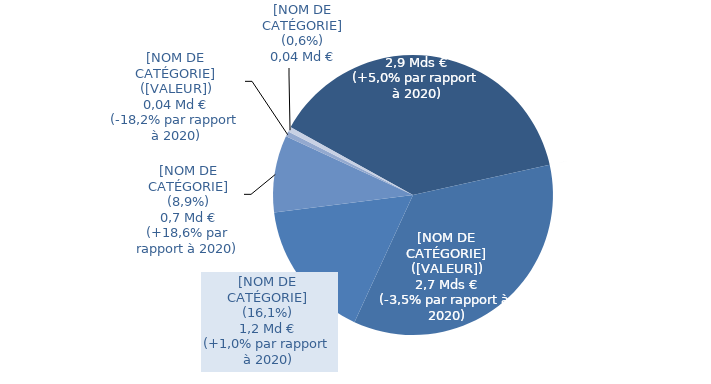
| Category | Series 0 |
|---|---|
| ITAF | 0.385 |
| Contributions Régime général | 0 |
| Compensation démographique | 0.353 |
| Cotisations sociales | 0.161 |
| Autres produits** | 0.089 |
| Prise en charge de prestations* | 0.006 |
| Contribution Sociale Généralisée | 0 |
| Cotisations prises en charge par l'Etat | 0.006 |